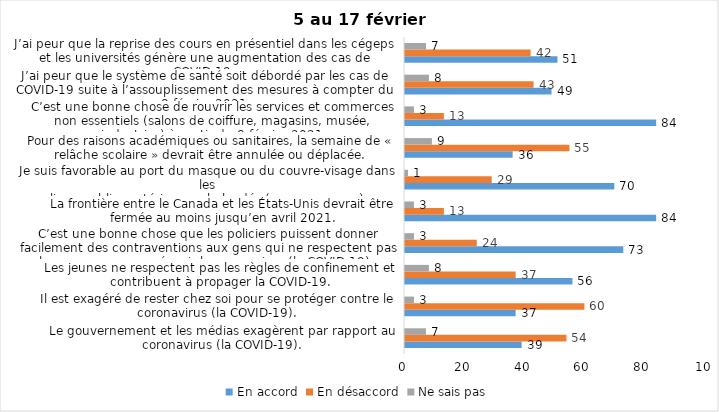
| Category | En accord | En désaccord | Ne sais pas |
|---|---|---|---|
| Le gouvernement et les médias exagèrent par rapport au coronavirus (la COVID-19). | 39 | 54 | 7 |
| Il est exagéré de rester chez soi pour se protéger contre le coronavirus (la COVID-19). | 37 | 60 | 3 |
| Les jeunes ne respectent pas les règles de confinement et contribuent à propager la COVID-19. | 56 | 37 | 8 |
| C’est une bonne chose que les policiers puissent donner facilement des contraventions aux gens qui ne respectent pas les mesures pour prévenir le coronavirus (la COVID-19). | 73 | 24 | 3 |
| La frontière entre le Canada et les États-Unis devrait être fermée au moins jusqu’en avril 2021. | 84 | 13 | 3 |
| Je suis favorable au port du masque ou du couvre-visage dans les
lieux publics extérieurs achalandés (ex. rues, parcs) | 70 | 29 | 1 |
| Pour des raisons académiques ou sanitaires, la semaine de « relâche scolaire » devrait être annulée ou déplacée. | 36 | 55 | 9 |
| C’est une bonne chose de rouvrir les services et commerces non essentiels (salons de coiffure, magasins, musée, industries) à partir du 8 février 2021. | 84 | 13 | 3 |
| J’ai peur que le système de santé soit débordé par les cas de COVID-19 suite à l’assouplissement des mesures à compter du 8 février 2021. | 49 | 43 | 8 |
| J’ai peur que la reprise des cours en présentiel dans les cégeps et les universités génère une augmentation des cas de COVID-19. | 51 | 42 | 7 |